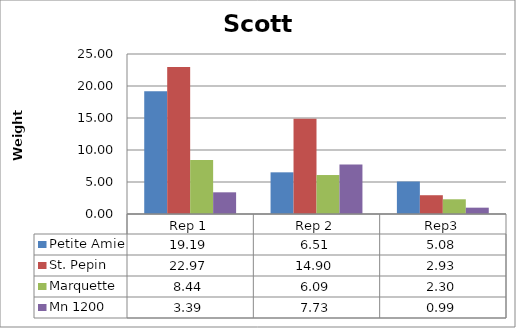
| Category | Petite Amie | St. Pepin | Marquette | Mn 1200 |
|---|---|---|---|---|
| 0 | 19.189 | 22.967 | 8.444 | 3.389 |
| 1 | 6.511 | 14.9 | 6.089 | 7.733 |
| 2 | 5.078 | 2.933 | 2.3 | 0.989 |